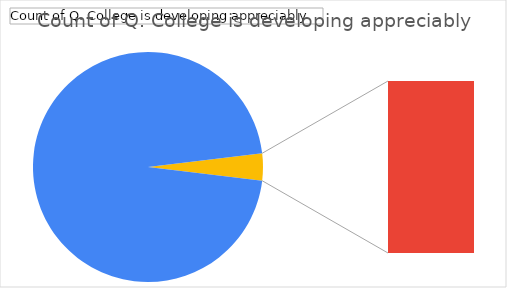
| Category | Total |
|---|---|
| Agree | 101 |
| Neutral | 4 |